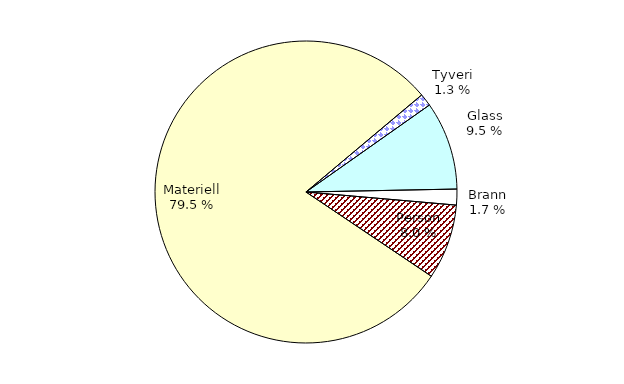
| Category | Series 0 |
|---|---|
| Tyveri | 248.154 |
| Glass | 1748.714 |
| Brann | 314.011 |
| Person | 1484.973 |
| Materiell | 14694.585 |